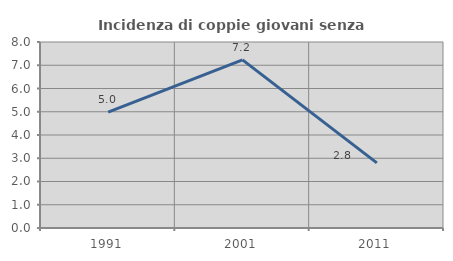
| Category | Incidenza di coppie giovani senza figli |
|---|---|
| 1991.0 | 4.983 |
| 2001.0 | 7.229 |
| 2011.0 | 2.801 |